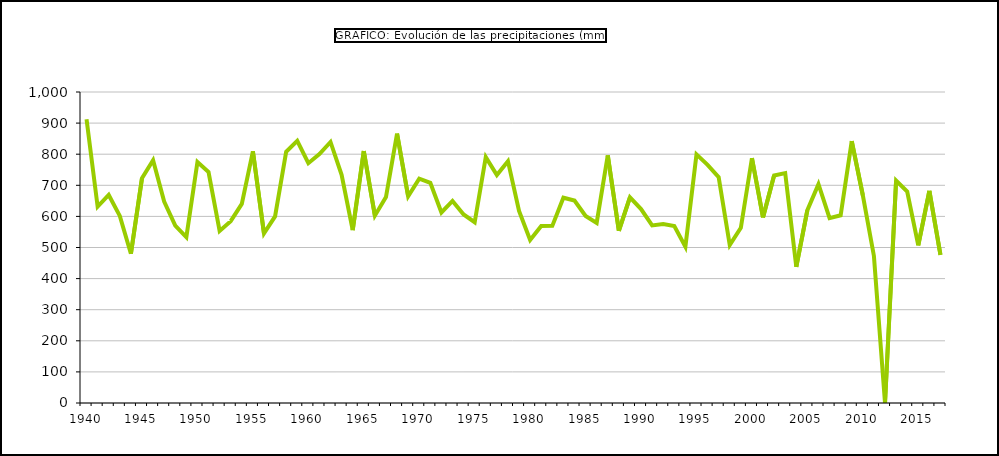
| Category | Precipitación (mm) |
|---|---|
| 1940 | 912.53 |
| 1941 | 631.39 |
| 1942 | 668.9 |
| 1943 | 601.59 |
| 1944 | 479.95 |
| 1945 | 723 |
| 1946 | 780.54 |
| 1947 | 647.81 |
| 1948 | 570.36 |
| 1949 | 533.43 |
| 1950 | 775.04 |
| 1951 | 742.54 |
| 1952 | 553.43 |
| 1953 | 584.56 |
| 1954 | 640.07 |
| 1955 | 809.21 |
| 1956 | 545.43 |
| 1957 | 599.89 |
| 1958 | 807.59 |
| 1959 | 842.8 |
| 1960 | 770.96 |
| 1961 | 800.26 |
| 1962 | 839.29 |
| 1963 | 733.72 |
| 1964 | 555.87 |
| 1965 | 810.05 |
| 1966 | 602.32 |
| 1967 | 662.08 |
| 1968 | 866.16 |
| 1969 | 664.8 |
| 1970 | 721.61 |
| 1971 | 708.1 |
| 1972 | 612.63 |
| 1973 | 649.82 |
| 1974 | 606.1 |
| 1975 | 581.29 |
| 1976 | 790.72 |
| 1977 | 732.89 |
| 1978 | 777.65 |
| 1979 | 617.83 |
| 1980 | 524.16 |
| 1981 | 569.46 |
| 1982 | 569.53 |
| 1983 | 660.16 |
| 1984 | 651.17 |
| 1985 | 601.34 |
| 1986 | 579.07 |
| 1987 | 796.27 |
| 1988 | 553.78 |
| 1989 | 661.42 |
| 1990 | 623.58 |
| 1991 | 570.95 |
| 1992 | 575.12 |
| 1993 | 569.11 |
| 1994 | 502.77 |
| 1995 | 799.4 |
| 1996 | 765.88 |
| 1997 | 726.37 |
| 1998 | 507.85 |
| 1999 | 563.59 |
| 2000 | 787.06 |
| 2001 | 596.85 |
| 2002 | 731.56 |
| 2003 | 739.28 |
| 2004 | 437.98 |
| 2005 | 620.05 |
| 2006 | 703.57 |
| 2007 | 594.59 |
| 2008 | 603.55 |
| 2009 | 841.9 |
| 2010 | 668 |
| 2011 | 472.67 |
| 2012 * | 0 |
| 2013 | 715 |
| 2014 | 680 |
| 2015 | 507 |
| 2016 | 682 |
| 2017 | 476 |